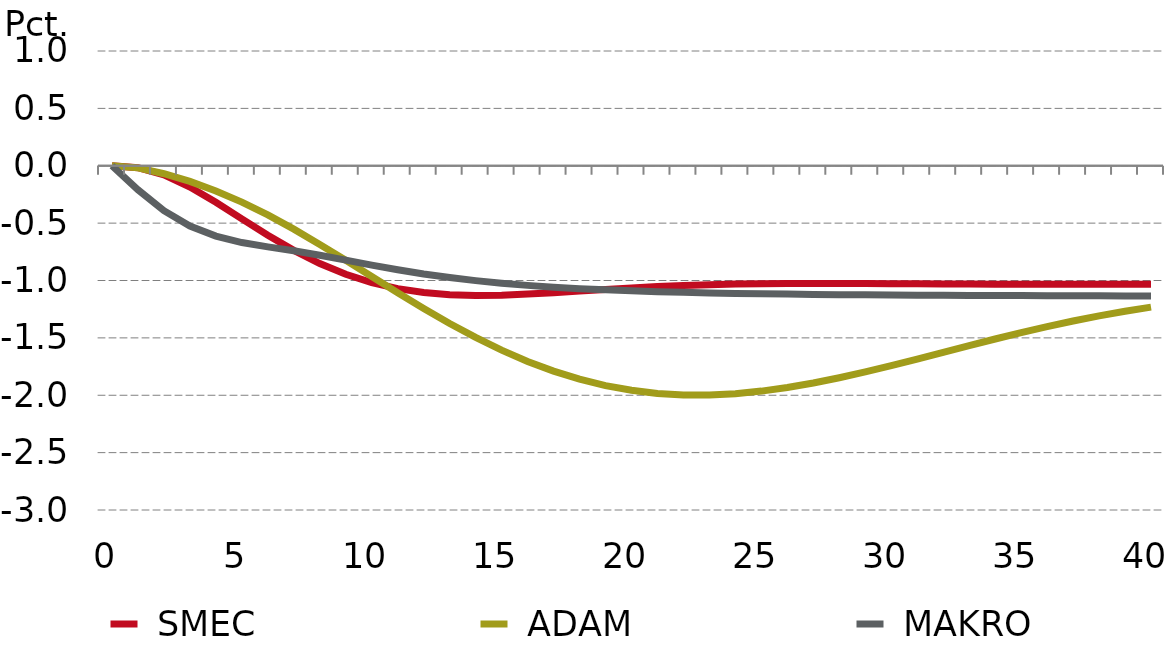
| Category |  SMEC |  ADAM |  MAKRO |
|---|---|---|---|
| 0.0 | 0 | 0 | 0 |
| nan | -0.017 | -0.019 | -0.21 |
| nan | -0.08 | -0.07 | -0.392 |
| nan | -0.185 | -0.137 | -0.525 |
| nan | -0.318 | -0.219 | -0.613 |
| 5.0 | -0.463 | -0.317 | -0.669 |
| nan | -0.606 | -0.429 | -0.707 |
| nan | -0.738 | -0.553 | -0.741 |
| nan | -0.852 | -0.685 | -0.78 |
| nan | -0.946 | -0.824 | -0.822 |
| 10.0 | -1.019 | -0.966 | -0.866 |
| nan | -1.071 | -1.107 | -0.907 |
| nan | -1.105 | -1.244 | -0.943 |
| nan | -1.124 | -1.374 | -0.975 |
| nan | -1.13 | -1.496 | -1.001 |
| 15.0 | -1.128 | -1.607 | -1.023 |
| nan | -1.119 | -1.705 | -1.042 |
| nan | -1.106 | -1.79 | -1.058 |
| nan | -1.092 | -1.86 | -1.071 |
| nan | -1.078 | -1.916 | -1.081 |
| 20.0 | -1.064 | -1.957 | -1.09 |
| nan | -1.053 | -1.984 | -1.097 |
| nan | -1.043 | -1.997 | -1.103 |
| nan | -1.036 | -1.997 | -1.108 |
| nan | -1.031 | -1.986 | -1.112 |
| 25.0 | -1.028 | -1.964 | -1.116 |
| nan | -1.026 | -1.933 | -1.119 |
| nan | -1.025 | -1.893 | -1.121 |
| nan | -1.026 | -1.847 | -1.123 |
| nan | -1.027 | -1.796 | -1.125 |
| 30.0 | -1.028 | -1.742 | -1.126 |
| nan | -1.029 | -1.684 | -1.128 |
| nan | -1.03 | -1.626 | -1.129 |
| nan | -1.031 | -1.567 | -1.13 |
| nan | -1.032 | -1.51 | -1.131 |
| 35.0 | -1.032 | -1.454 | -1.132 |
| nan | -1.033 | -1.402 | -1.133 |
| nan | -1.033 | -1.353 | -1.133 |
| nan | -1.033 | -1.308 | -1.134 |
| nan | -1.033 | -1.268 | -1.134 |
| 40.0 | -1.032 | -1.232 | -1.135 |